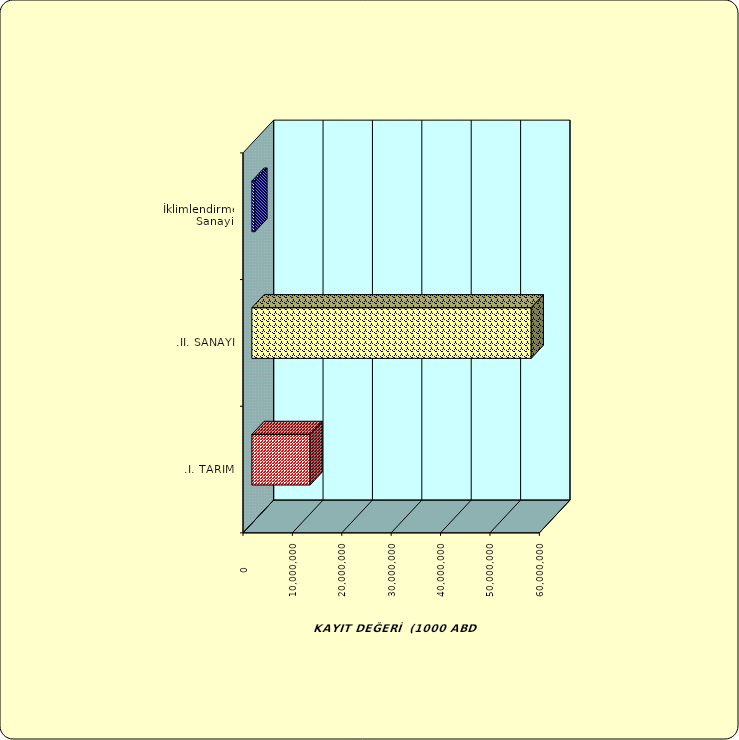
| Category | Series 0 |
|---|---|
| .I. TARIM | 11778650.976 |
| .II. SANAYİ | 56554243.244 |
|  İklimlendirme Sanayii | 601790.679 |